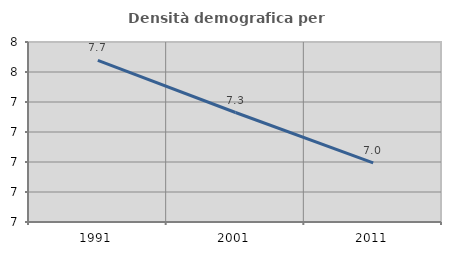
| Category | Densità demografica |
|---|---|
| 1991.0 | 7.677 |
| 2001.0 | 7.33 |
| 2011.0 | 6.994 |